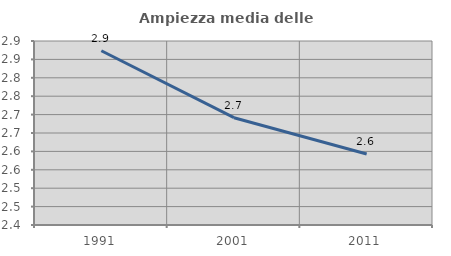
| Category | Ampiezza media delle famiglie |
|---|---|
| 1991.0 | 2.873 |
| 2001.0 | 2.692 |
| 2011.0 | 2.593 |